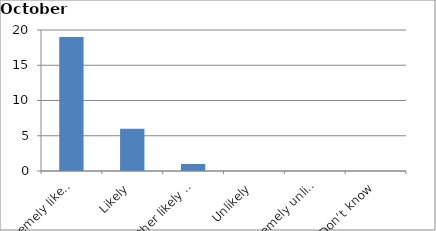
| Category | Series 0 |
|---|---|
| Extremely likely | 19 |
| Likely | 6 |
| Neither likely nor unlikely | 1 |
| Unlikely | 0 |
| Extremely unlikely | 0 |
| Don’t know | 0 |